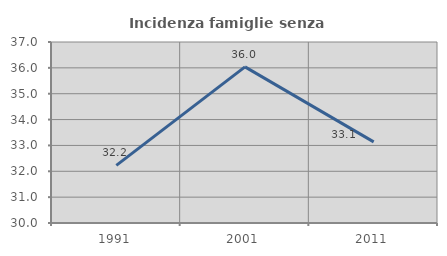
| Category | Incidenza famiglie senza nuclei |
|---|---|
| 1991.0 | 32.227 |
| 2001.0 | 36.039 |
| 2011.0 | 33.136 |